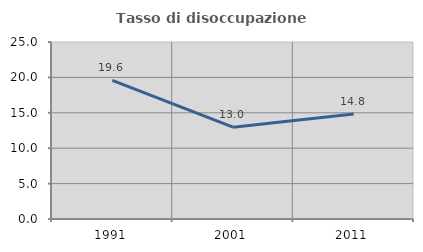
| Category | Tasso di disoccupazione giovanile  |
|---|---|
| 1991.0 | 19.588 |
| 2001.0 | 12.963 |
| 2011.0 | 14.815 |